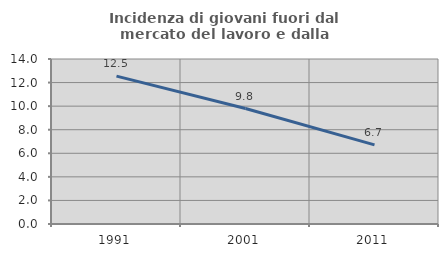
| Category | Incidenza di giovani fuori dal mercato del lavoro e dalla formazione  |
|---|---|
| 1991.0 | 12.546 |
| 2001.0 | 9.797 |
| 2011.0 | 6.718 |